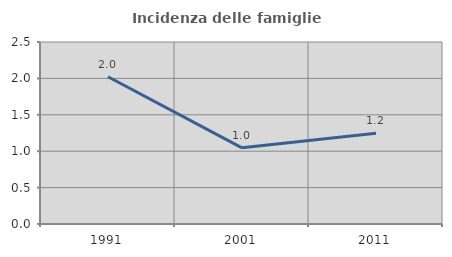
| Category | Incidenza delle famiglie numerose |
|---|---|
| 1991.0 | 2.023 |
| 2001.0 | 1.047 |
| 2011.0 | 1.245 |